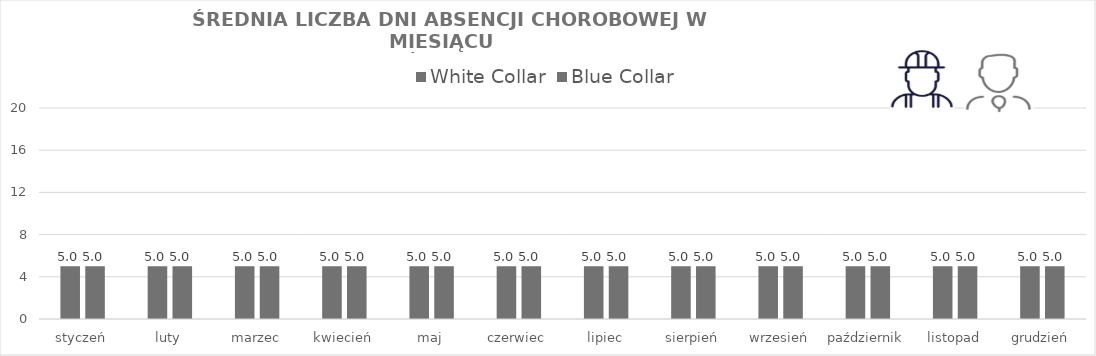
| Category | White Collar | Blue Collar |
|---|---|---|
| styczeń | 5 | 5 |
| luty | 5 | 5 |
| marzec | 5 | 5 |
| kwiecień | 5 | 5 |
| maj | 5 | 5 |
| czerwiec | 5 | 5 |
| lipiec | 5 | 5 |
| sierpień | 5 | 5 |
| wrzesień | 5 | 5 |
| październik | 5 | 5 |
| listopad | 5 | 5 |
| grudzień | 5 | 5 |